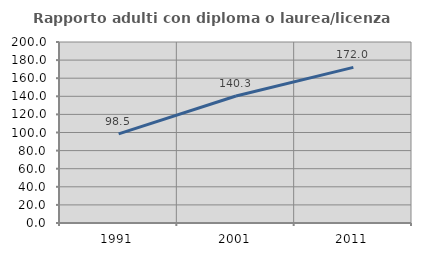
| Category | Rapporto adulti con diploma o laurea/licenza media  |
|---|---|
| 1991.0 | 98.549 |
| 2001.0 | 140.337 |
| 2011.0 | 171.977 |